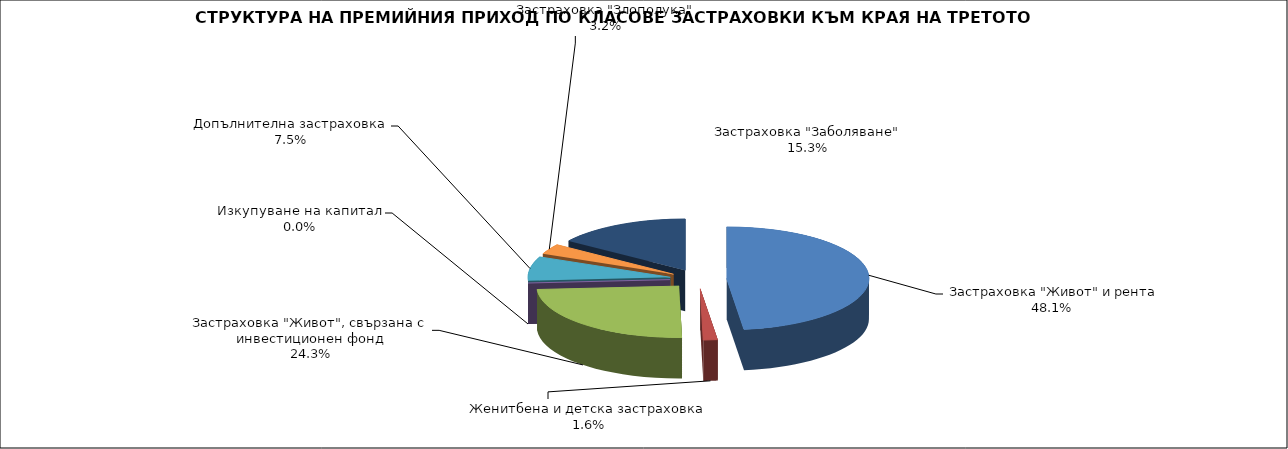
| Category |  Застраховка "Живот" и рента |
|---|---|
|  Застраховка "Живот" и рента | 214683304.765 |
| Женитбена и детска застраховка | 7221223.257 |
| Застраховка "Живот", свързана с инвестиционен фонд | 108423240.465 |
| Изкупуване на капитал | 0 |
| Допълнителна застраховка | 33721530.59 |
| Застраховка "Злополука" | 14461153.284 |
| Застраховка "Заболяване" | 68223736.541 |